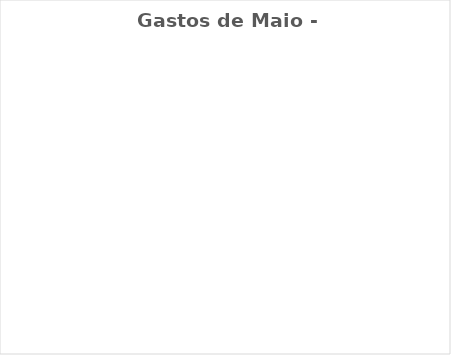
| Category | Gastos de Maio - Real |
|---|---|
| Despesas Mensais | 0 |
| Aposentadoria/Pagar à si | 0 |
| Gratidão/ Doação/ Dizimo | 0 |
| Desejos | 0 |
| Dívidas/Investimentos | 0 |